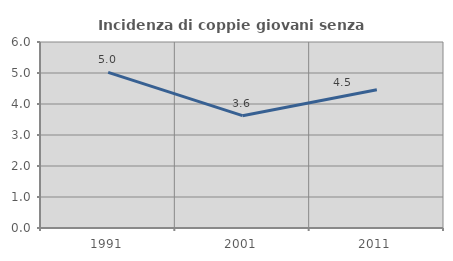
| Category | Incidenza di coppie giovani senza figli |
|---|---|
| 1991.0 | 5.019 |
| 2001.0 | 3.623 |
| 2011.0 | 4.461 |